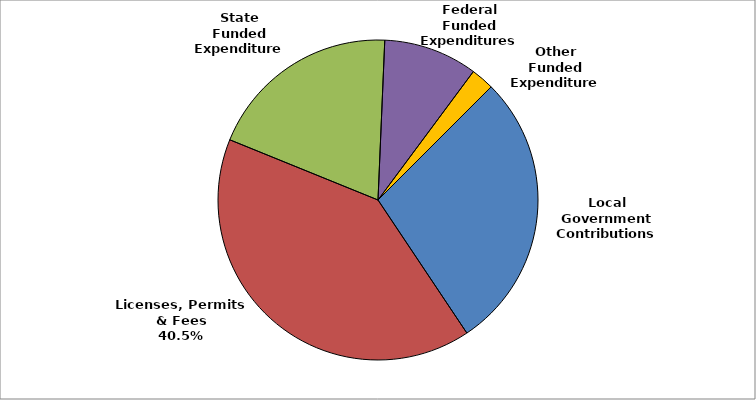
| Category | Series 0 |
|---|---|
| Local Government Contributions | 0.281 |
| Licenses, Permits & Fees | 0.405 |
| State Funded Expenditures | 0.195 |
| Federal Funded Expenditures | 0.095 |
| Other Funded Expenditures | 0.023 |